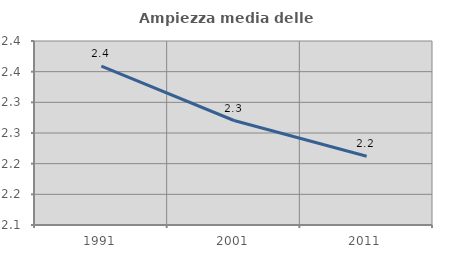
| Category | Ampiezza media delle famiglie |
|---|---|
| 1991.0 | 2.359 |
| 2001.0 | 2.27 |
| 2011.0 | 2.212 |